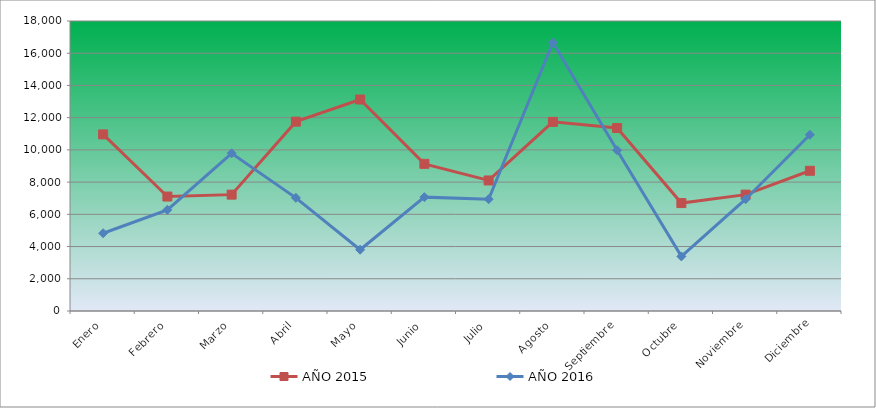
| Category | AÑO 2015 | AÑO 2016 |
|---|---|---|
| Enero | 10961.239 | 4826.123 |
| Febrero | 7104.506 | 6280.094 |
| Marzo | 7222.915 | 9787.943 |
| Abril | 11752.589 | 7022.822 |
| Mayo | 13127.479 | 3804.865 |
| Junio | 9134.365 | 7067.469 |
| Julio | 8102.52 | 6938.21 |
| Agosto | 11739.351 | 16662.567 |
| Septiembre | 11359.12 | 9982.16 |
| Octubre | 6698.535 | 3389.131 |
| Noviembre | 7224.071 | 6938.21 |
| Diciembre | 8703.855 | 10941.327 |